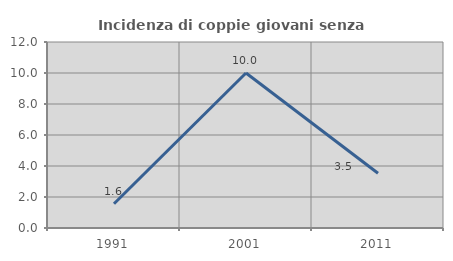
| Category | Incidenza di coppie giovani senza figli |
|---|---|
| 1991.0 | 1.562 |
| 2001.0 | 10 |
| 2011.0 | 3.529 |